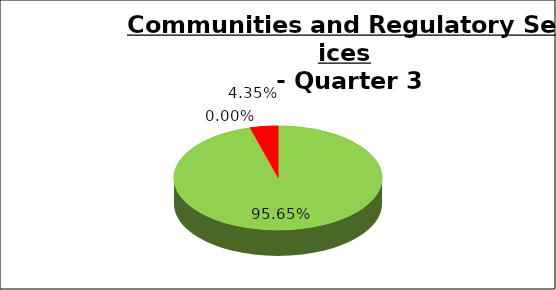
| Category | Q3 |
|---|---|
| Green | 0.957 |
| Amber | 0 |
| Red | 0.043 |